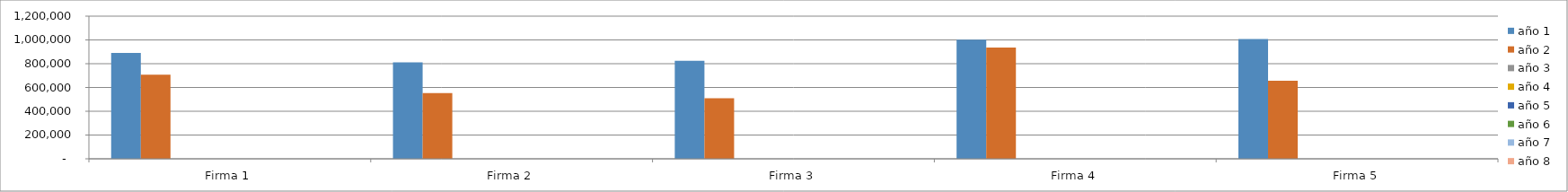
| Category | año 1 | año 2 | año 3 | año 4 | año 5 | año 6 | año 7 | año 8 |
|---|---|---|---|---|---|---|---|---|
| Firma 1 | 890450.022 | 707381.085 | 0 | 0 | 0 | 0 | 0 | 0 |
| Firma 2 | 812025.331 | 553745.113 | 0 | 0 | 0 | 0 | 0 | 0 |
| Firma 3 | 825124.008 | 509789.755 | 0 | 0 | 0 | 0 | 0 | 0 |
| Firma 4 | 1001719.655 | 935034.101 | 0 | 0 | 0 | 0 | 0 | 0 |
| Firma 5 | 1007894.408 | 656943.693 | 0 | 0 | 0 | 0 | 0 | 0 |